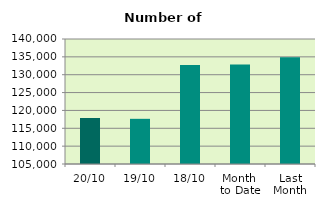
| Category | Series 0 |
|---|---|
| 20/10 | 117882 |
| 19/10 | 117650 |
| 18/10 | 132730 |
| Month 
to Date | 132839.857 |
| Last
Month | 134880 |